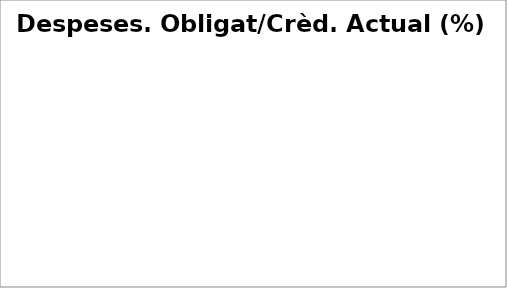
| Category | Series 0 |
|---|---|
| Despeses de personal | 0.999 |
| Despeses en béns corrents i serveis | 0.954 |
| Despeses financeres | 0.744 |
| Transferències corrents | 0.99 |
| Fons de contingència | 0 |
| Inversions reals | 0.973 |
| Transferències de capital | 0.996 |
| Actius financers | 0.682 |
| Passius financers | 0.996 |